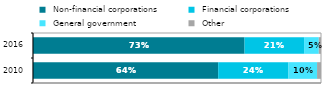
| Category |  Non-financial corporations |  Financial corporations |  General government |  Other |
|---|---|---|---|---|
| 2010.0 | 0.643 | 0.244 | 0.099 | 0.014 |
| 2016.0 | 0.735 | 0.207 | 0.051 | 0.008 |